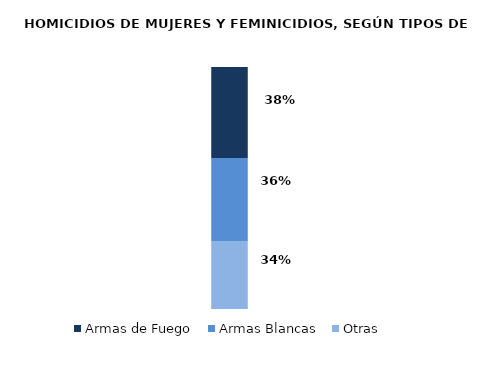
| Category | Otras | Armas Blancas | Armas de Fuego |
|---|---|---|---|
| 0 | 46 | 57 | 62 |